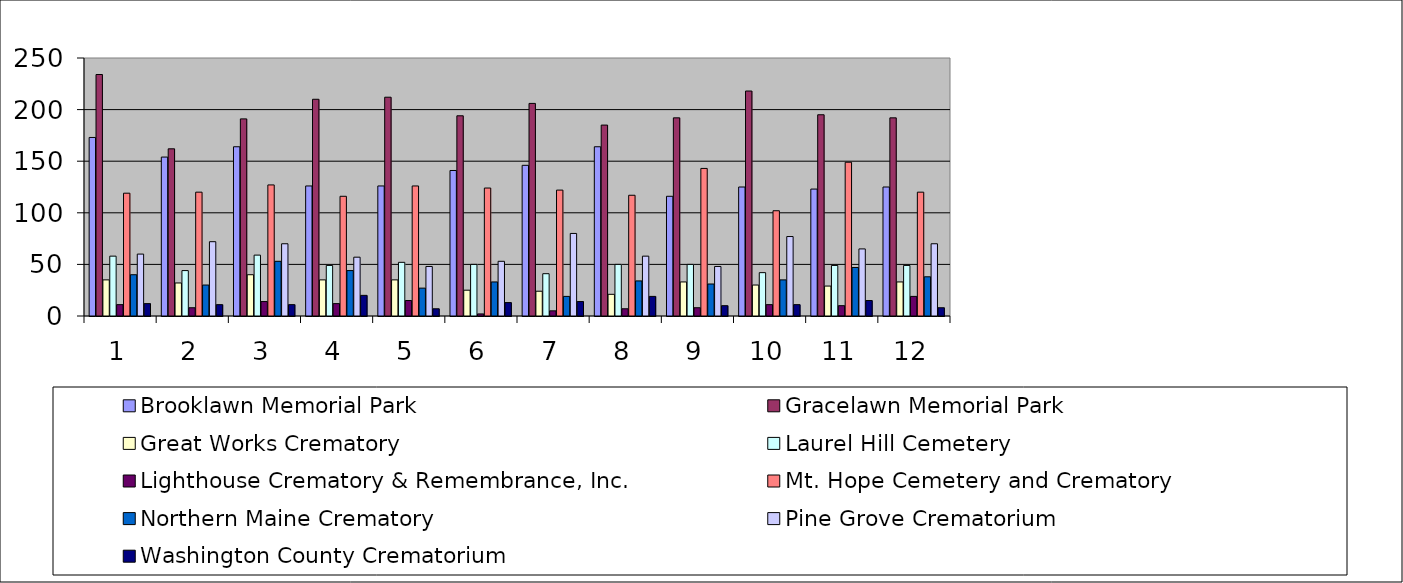
| Category | Brooklawn Memorial Park | Gracelawn Memorial Park | Great Works Crematory | Laurel Hill Cemetery | Lighthouse Crematory & Remembrance, Inc. | Mt. Hope Cemetery and Crematory | Northern Maine Crematory | Pine Grove Crematorium | Washington County Crematorium |
|---|---|---|---|---|---|---|---|---|---|
| 0 | 173 | 234 | 35 | 58 | 11 | 119 | 40 | 60 | 12 |
| 1 | 154 | 162 | 32 | 44 | 8 | 120 | 30 | 72 | 11 |
| 2 | 164 | 191 | 40 | 59 | 14 | 127 | 53 | 70 | 11 |
| 3 | 126 | 210 | 35 | 49 | 12 | 116 | 44 | 57 | 20 |
| 4 | 126 | 212 | 35 | 52 | 15 | 126 | 27 | 48 | 7 |
| 5 | 141 | 194 | 25 | 50 | 2 | 124 | 33 | 53 | 13 |
| 6 | 146 | 206 | 24 | 41 | 5 | 122 | 19 | 80 | 14 |
| 7 | 164 | 185 | 21 | 50 | 7 | 117 | 34 | 58 | 19 |
| 8 | 116 | 192 | 33 | 50 | 8 | 143 | 31 | 48 | 10 |
| 9 | 125 | 218 | 30 | 42 | 11 | 102 | 35 | 77 | 11 |
| 10 | 123 | 195 | 29 | 49 | 10 | 149 | 47 | 65 | 15 |
| 11 | 125 | 192 | 33 | 49 | 19 | 120 | 38 | 70 | 8 |